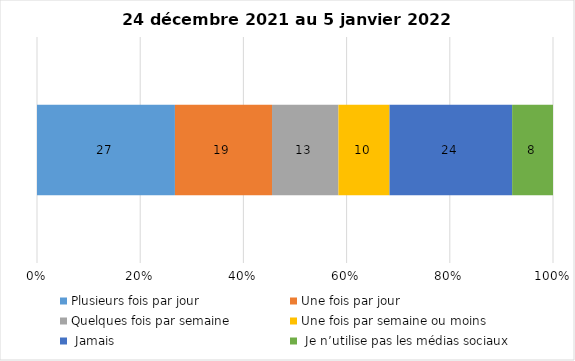
| Category | Plusieurs fois par jour | Une fois par jour | Quelques fois par semaine   | Une fois par semaine ou moins   |  Jamais   |  Je n’utilise pas les médias sociaux |
|---|---|---|---|---|---|---|
| 0 | 27 | 19 | 13 | 10 | 24 | 8 |